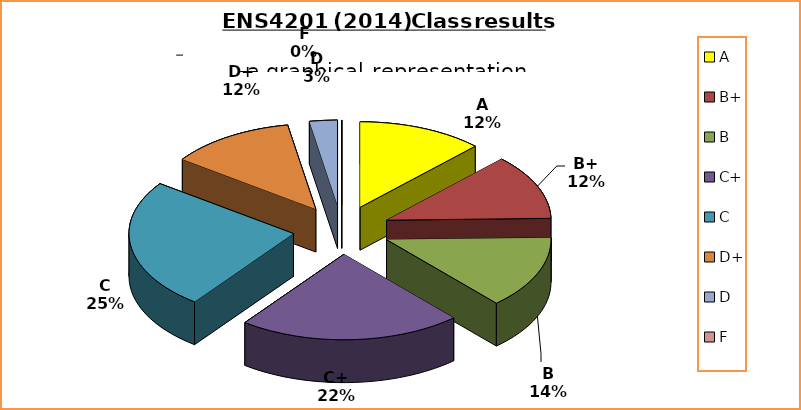
| Category | Series 0 |
|---|---|
| A | 9 |
| B+ | 9 |
| B | 10 |
| C+ | 16 |
| C | 18 |
| D+ | 9 |
| D | 2 |
| F | 0 |